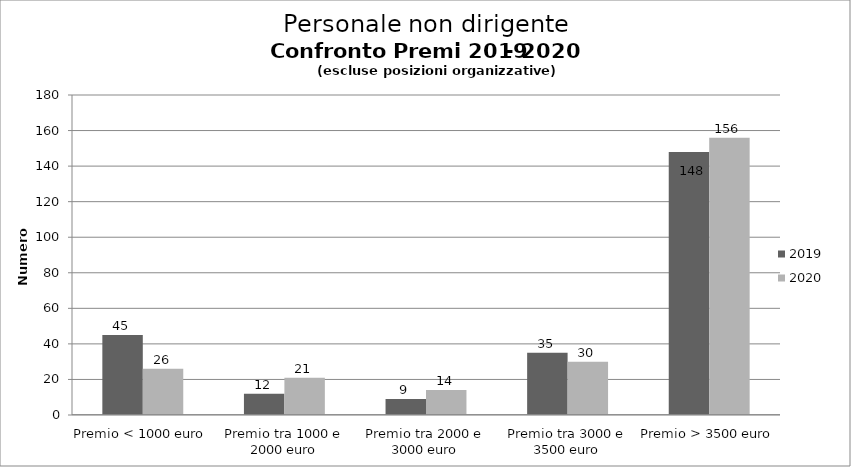
| Category | 2019 | 2020 |
|---|---|---|
| Premio < 1000 euro | 45 | 26 |
| Premio tra 1000 e 2000 euro | 12 | 21 |
| Premio tra 2000 e 3000 euro | 9 | 14 |
| Premio tra 3000 e 3500 euro | 35 | 30 |
| Premio > 3500 euro | 148 | 156 |